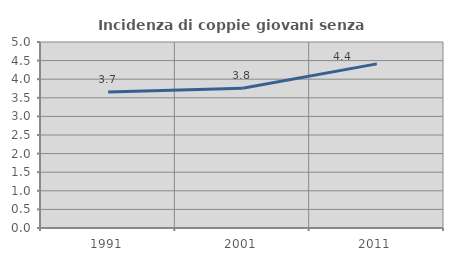
| Category | Incidenza di coppie giovani senza figli |
|---|---|
| 1991.0 | 3.659 |
| 2001.0 | 3.759 |
| 2011.0 | 4.412 |